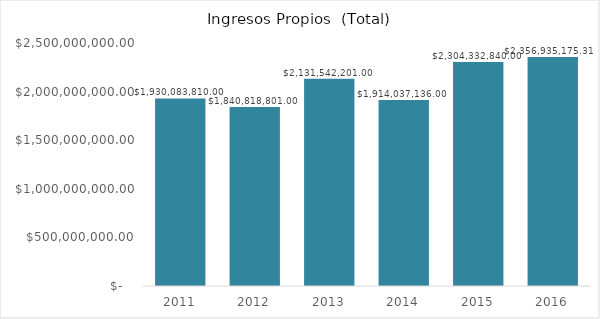
| Category | Ingresos Propios (total) |
|---|---|
| 2011.0 | 1930083810 |
| 2012.0 | 1840818801 |
| 2013.0 | 2131542201 |
| 2014.0 | 1914037136 |
| 2015.0 | 2304332840 |
| 2016.0 | 2356935175.31 |